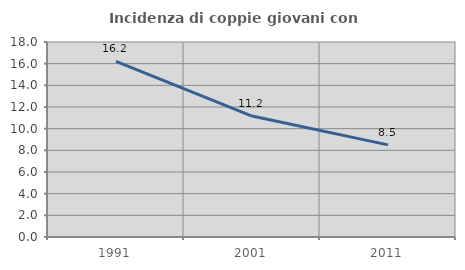
| Category | Incidenza di coppie giovani con figli |
|---|---|
| 1991.0 | 16.204 |
| 2001.0 | 11.165 |
| 2011.0 | 8.504 |